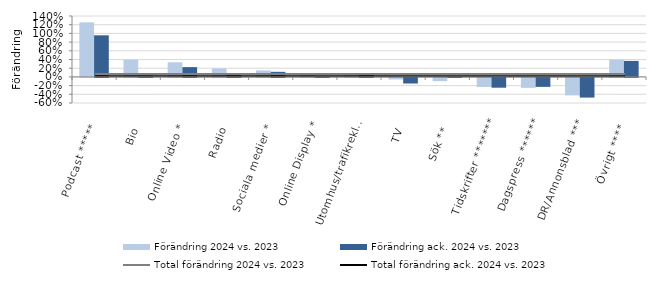
| Category | Förändring 2024 vs. 2023 | Förändring ack. 2024 vs. 2023 |
|---|---|---|
| Podcast ***** | 1.254 | 0.956 |
| Bio | 0.394 | 0.033 |
| Online Video * | 0.336 | 0.225 |
| Radio | 0.196 | 0.077 |
| Sociala medier * | 0.149 | 0.117 |
| Online Display * | 0.087 | 0.018 |
| Utomhus/trafikreklam | 0.042 | 0.081 |
| TV | -0.036 | -0.129 |
| Sök ** | -0.075 | 0 |
| Tidskrifter ******* | -0.208 | -0.225 |
| Dagspress ****** | -0.229 | -0.206 |
| DR/Annonsblad *** | -0.402 | -0.452 |
| Övrigt **** | 0.393 | 0.368 |